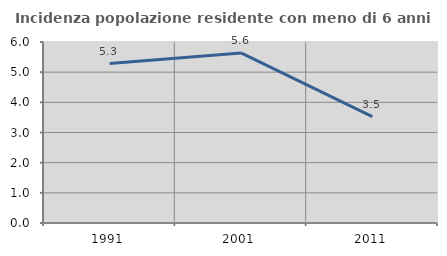
| Category | Incidenza popolazione residente con meno di 6 anni |
|---|---|
| 1991.0 | 5.285 |
| 2001.0 | 5.638 |
| 2011.0 | 3.525 |